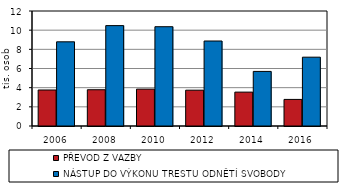
| Category | PŘEVOD Z VAZBY | NÁSTUP DO VÝKONU TRESTU ODNĚTÍ SVOBODY |
|---|---|---|
| 2006.0 | 3757 | 8784 |
| 2008.0 | 3784 | 10475 |
| 2010.0 | 3847 | 10360 |
| 2012.0 | 3738 | 8869 |
| 2014.0 | 3535 | 5696 |
| 2016.0 | 2775 | 7182 |